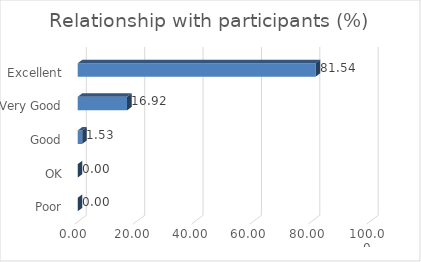
| Category | Relationship with participants (%) |
|---|---|
| Poor | 0 |
| OK | 0 |
| Good | 1.53 |
| Very Good | 16.92 |
| Excellent | 81.54 |